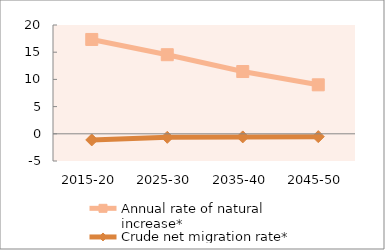
| Category | Annual rate of natural increase* | Crude net migration rate* |
|---|---|---|
| 2015-20 | 17.343 | -1.131 |
| 2025-30 | 14.539 | -0.648 |
| 2035-40 | 11.448 | -0.573 |
| 2045-50 | 9.005 | -0.52 |